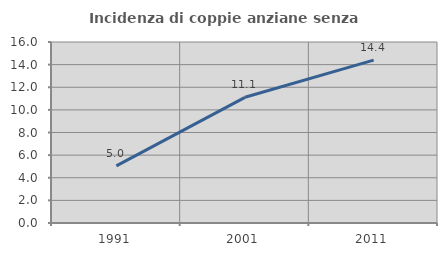
| Category | Incidenza di coppie anziane senza figli  |
|---|---|
| 1991.0 | 5.045 |
| 2001.0 | 11.111 |
| 2011.0 | 14.4 |